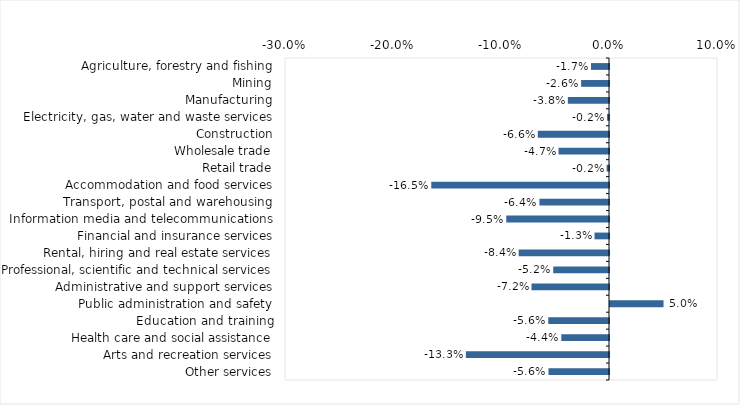
| Category | This week |
|---|---|
| Agriculture, forestry and fishing | -0.017 |
| Mining | -0.026 |
| Manufacturing | -0.038 |
| Electricity, gas, water and waste services | -0.002 |
| Construction | -0.066 |
| Wholesale trade | -0.047 |
| Retail trade | -0.002 |
| Accommodation and food services | -0.165 |
| Transport, postal and warehousing | -0.064 |
| Information media and telecommunications | -0.095 |
| Financial and insurance services | -0.013 |
| Rental, hiring and real estate services | -0.084 |
| Professional, scientific and technical services | -0.052 |
| Administrative and support services | -0.072 |
| Public administration and safety | 0.05 |
| Education and training | -0.056 |
| Health care and social assistance | -0.044 |
| Arts and recreation services | -0.133 |
| Other services | -0.056 |